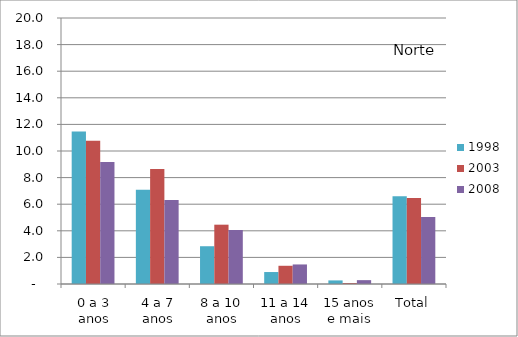
| Category | 1998 | 2003 | 2008 |
|---|---|---|---|
| 0 a 3 anos | 11.46 | 10.77 | 9.18 |
| 4 a 7 anos | 7.09 | 8.65 | 6.31 |
| 8 a 10 anos | 2.84 | 4.46 | 4.06 |
| 11 a 14 anos | 0.9 | 1.37 | 1.47 |
| 15 anos e mais | 0.27 | 0.07 | 0.29 |
| Total | 6.59 | 6.46 | 5.03 |